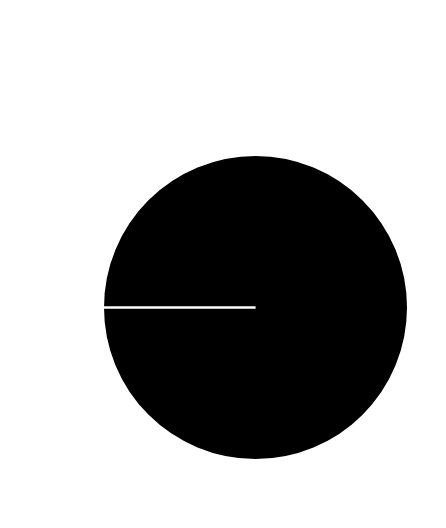
| Category | Series 1 |
|---|---|
| 0 | 0 |
| 1 | 3 |
| 2 | 0 |